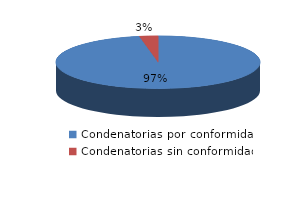
| Category | Series 0 |
|---|---|
| 0 | 33 |
| 1 | 1 |